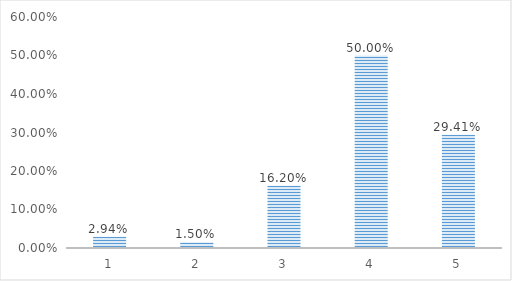
| Category | Series 0 |
|---|---|
| 1.0 | 0.029 |
| 2.0 | 0.015 |
| 3.0 | 0.162 |
| 4.0 | 0.5 |
| 5.0 | 0.294 |